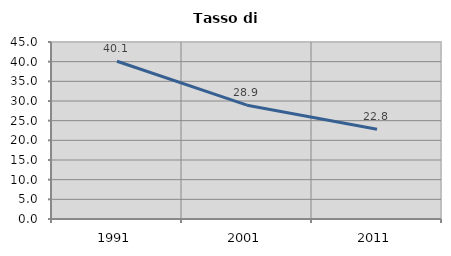
| Category | Tasso di disoccupazione   |
|---|---|
| 1991.0 | 40.116 |
| 2001.0 | 28.941 |
| 2011.0 | 22.807 |